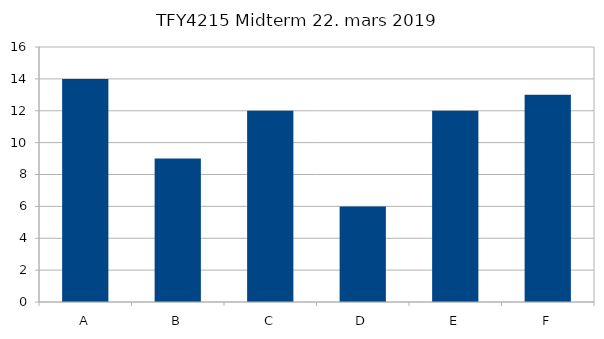
| Category | Series 0 |
|---|---|
| A | 14 |
| B | 9 |
| C | 12 |
| D | 6 |
| E | 12 |
| F | 13 |